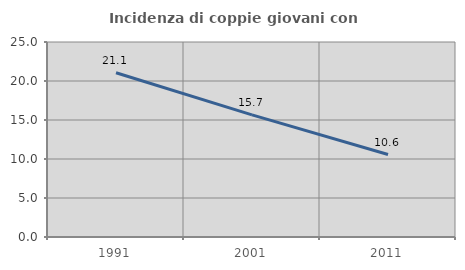
| Category | Incidenza di coppie giovani con figli |
|---|---|
| 1991.0 | 21.053 |
| 2001.0 | 15.657 |
| 2011.0 | 10.573 |